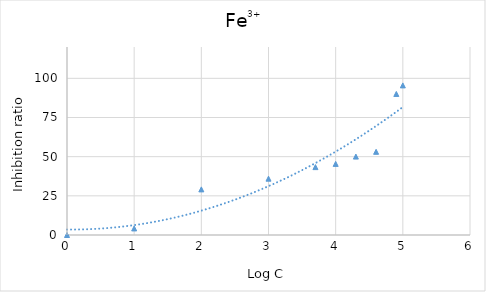
| Category | Fe3+ |
|---|---|
| 0.0 | 0 |
| 1.0 | 4.192 |
| 2.0 | 29.118 |
| 3.0 | 35.957 |
| 3.6989700043360187 | 43.329 |
| 4.0 | 45.388 |
| 4.301029995663981 | 50.049 |
| 4.6020599913279625 | 53.092 |
| 4.903089986991944 | 90.028 |
| 5.0 | 95.491 |